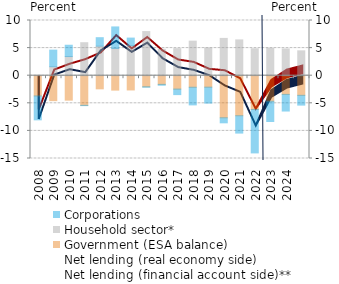
| Category | Government (ESA balance) | Household sector* | Corporations |
|---|---|---|---|
| 2008.0 | -3.672 | 0.059 | -4.324 |
| 2009.0 | -4.521 | 1.63 | 3.005 |
| 2010.0 | -4.43 | 3.467 | 2.05 |
| 2011.0 | -5.368 | 5.977 | -0.052 |
| 2012.0 | -2.381 | 5.353 | 1.533 |
| 2013.0 | -2.611 | 4.941 | 3.894 |
| 2014.0 | -2.581 | 5.444 | 1.368 |
| 2015.0 | -2.003 | 7.994 | -0.09 |
| 2016.0 | -1.573 | 4.78 | -0.154 |
| 2017.0 | -2.428 | 4.895 | -0.997 |
| 2018.0 | -2.094 | 6.259 | -3.196 |
| 2019.0 | -2.078 | 5.026 | -2.887 |
| 2020.0 | -7.623 | 6.761 | -0.914 |
| 2021.0 | -7.254 | 6.485 | -3.142 |
| 2022.0 | -6.114 | 4.881 | -7.874 |
| 2023.0 | -4.633 | 4.973 | -3.662 |
| 2024.0 | -3.387 | 4.851 | -3.015 |
| 2025.0 | -3.557 | 4.504 | -1.772 |